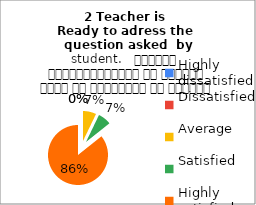
| Category | 2 Teacher is 
Ready to adress the  question asked  by student.   शिक्षक विद्यार्थियों के द्वारा पूछे गए प्रश्नों का समाधान करने हेतु तत्पर रहते हैं |
|---|---|
| Highly dissatisfied | 0 |
| Dissatisfied | 0 |
| Average | 1 |
| Satisfied | 1 |
| Highly satisfied | 12 |